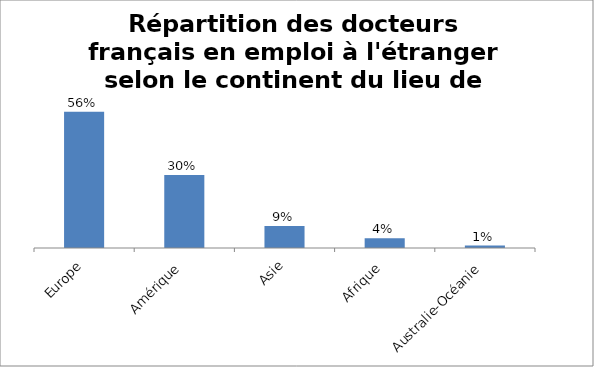
| Category | Series 0 |
|---|---|
| Europe | 0.56 |
| Amérique | 0.3 |
| Asie | 0.09 |
| Afrique | 0.04 |
| Australie-Océanie | 0.01 |